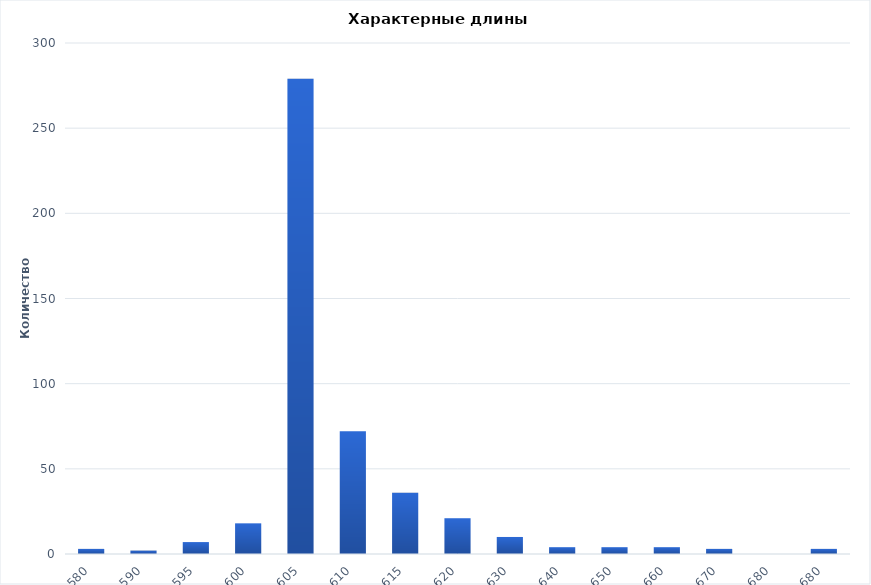
| Category | Series 0 |
|---|---|
| < 580 | 3 |
| 580-590 | 2 |
| 590-595 | 7 |
| 595-600 | 18 |
| 600-605 | 279 |
| 605-610 | 72 |
| 610-615 | 36 |
| 615-620 | 21 |
| 620-630 | 10 |
| 630-640 | 4 |
| 640-650 | 4 |
| 650-660 | 4 |
| 660-670 | 3 |
| 670-680 | 0 |
| >680 | 3 |